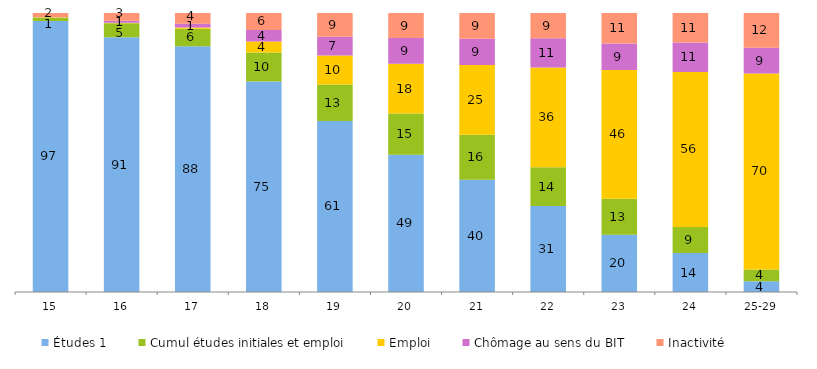
| Category | Études 1 | Cumul études initiales et emploi | Emploi | Chômage au sens du BIT | Inactivité |
|---|---|---|---|---|---|
| 15 | 97.14 | 1.21 | 0.09 | 0.03 | 1.53 |
| 16 | 91.3 | 5.01 | 0.16 | 0.73 | 2.8 |
| 17 | 88.11 | 6.25 | 0.44 | 1.34 | 3.87 |
| 18 | 75.44 | 10.37 | 3.97 | 4.14 | 6.08 |
| 19 | 61.31 | 13.05 | 10.4 | 6.7 | 8.54 |
| 20 | 49.22 | 14.78 | 17.82 | 9.2 | 8.98 |
| 21 | 40.24 | 16.15 | 24.93 | 9.47 | 9.21 |
| 22 | 30.78 | 13.97 | 35.68 | 10.5 | 9.06 |
| 23 | 20.48 | 12.92 | 46.18 | 9.46 | 10.95 |
| 24 | 13.96 | 9.37 | 55.5 | 10.61 | 10.57 |
| 25-29 | 3.81 | 4.28 | 70.26 | 9.16 | 12.48 |